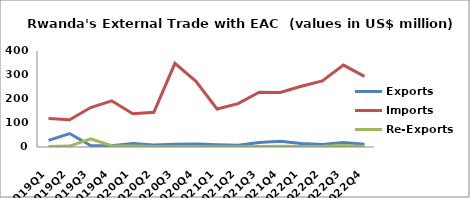
| Category | Exports | Imports | Re-Exports |
|---|---|---|---|
| 2019Q1 | 27.532 | 118.895 | 2.571 |
| 2019Q2 | 55.968 | 113.561 | 3.654 |
| 2019Q3 | 6.192 | 164.3 | 34.329 |
| 2019Q4 | 5.149 | 192.569 | 5.268 |
| 2020Q1 | 14.209 | 138.663 | 3.748 |
| 2020Q2 | 8.786 | 144.885 | 1.712 |
| 2020Q3 | 11.767 | 348.723 | 1.141 |
| 2020Q4 | 12.136 | 273.335 | 0.92 |
| 2021Q1 | 9.302 | 158.626 | 0.693 |
| 2021Q2 | 7.396 | 180.858 | 1.076 |
| 2021Q3 | 19.208 | 228.408 | 2.214 |
| 2021Q4 | 24.275 | 227.083 | 3.044 |
| 2022Q1 | 14.976 | 253.288 | 1.717 |
| 2022Q2 | 10.835 | 275.058 | 3.227 |
| 2022Q3 | 18.34 | 341.329 | 6.748 |
| 2022Q4 | 11.691 | 294.155 | 2.456 |